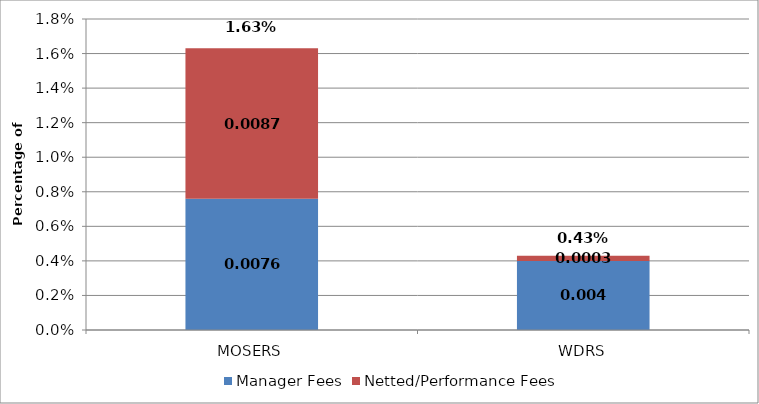
| Category | Manager Fees | Netted/Performance Fees |
|---|---|---|
| MOSERS | 0.008 | 0.009 |
| WDRS | 0.004 | 0 |